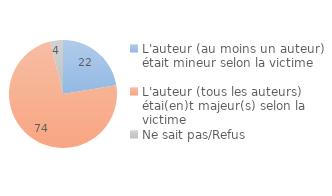
| Category | Series 0 |
|---|---|
| L'auteur (au moins un auteur) était mineur selon la victime | 22.425 |
| L'auteur (tous les auteurs) étai(en)t majeur(s) selon la victime | 73.735 |
| Ne sait pas/Refus | 3.84 |